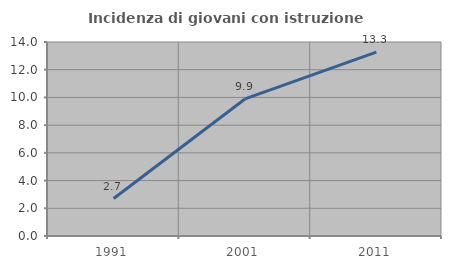
| Category | Incidenza di giovani con istruzione universitaria |
|---|---|
| 1991.0 | 2.703 |
| 2001.0 | 9.89 |
| 2011.0 | 13.274 |